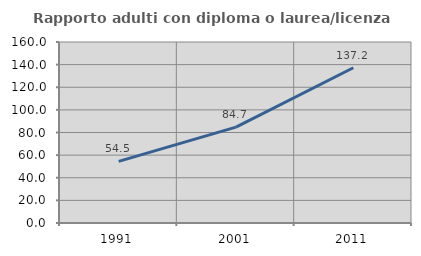
| Category | Rapporto adulti con diploma o laurea/licenza media  |
|---|---|
| 1991.0 | 54.513 |
| 2001.0 | 84.748 |
| 2011.0 | 137.233 |